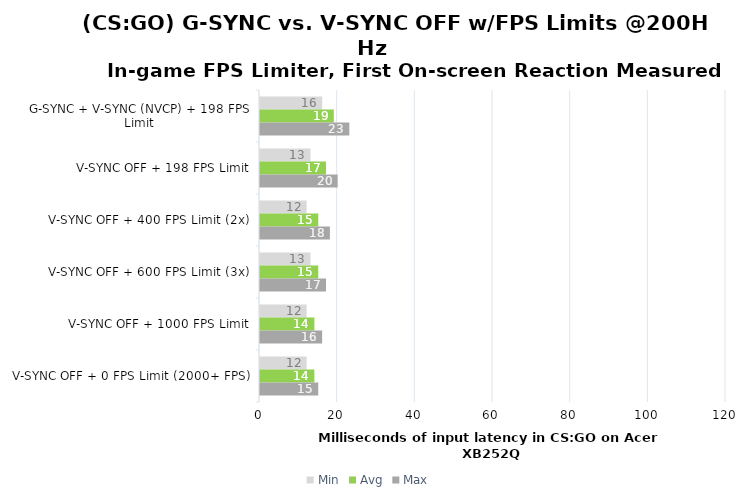
| Category | Min | Avg | Max |
|---|---|---|---|
| G-SYNC + V-SYNC (NVCP) + 198 FPS Limit | 16 | 19 | 23 |
| V-SYNC OFF + 198 FPS Limit | 13 | 17 | 20 |
| V-SYNC OFF + 400 FPS Limit (2x) | 12 | 15 | 18 |
| V-SYNC OFF + 600 FPS Limit (3x) | 13 | 15 | 17 |
| V-SYNC OFF + 1000 FPS Limit | 12 | 14 | 16 |
| V-SYNC OFF + 0 FPS Limit (2000+ FPS) | 12 | 14 | 15 |